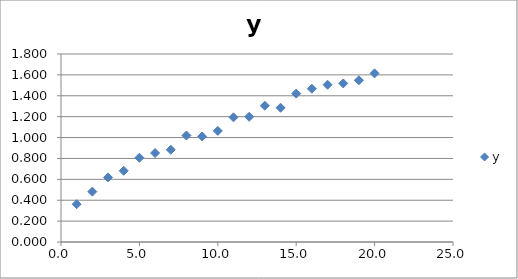
| Category | y |
|---|---|
| 1.0 | 0.362 |
| 2.0 | 0.482 |
| 3.0 | 0.618 |
| 4.0 | 0.682 |
| 5.0 | 0.807 |
| 6.0 | 0.852 |
| 7.0 | 0.883 |
| 8.0 | 1.02 |
| 9.0 | 1.011 |
| 10.0 | 1.064 |
| 11.0 | 1.194 |
| 12.0 | 1.198 |
| 13.0 | 1.305 |
| 14.0 | 1.285 |
| 15.0 | 1.421 |
| 16.0 | 1.467 |
| 17.0 | 1.506 |
| 18.0 | 1.518 |
| 19.0 | 1.548 |
| 20.0 | 1.615 |